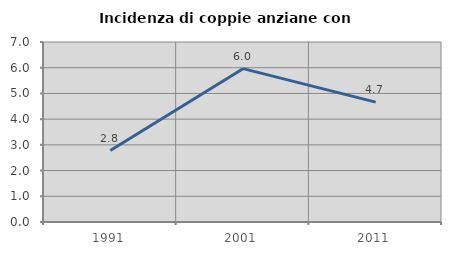
| Category | Incidenza di coppie anziane con figli |
|---|---|
| 1991.0 | 2.778 |
| 2001.0 | 5.963 |
| 2011.0 | 4.663 |